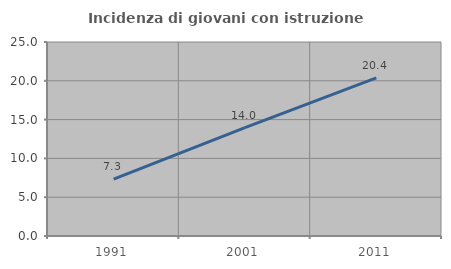
| Category | Incidenza di giovani con istruzione universitaria |
|---|---|
| 1991.0 | 7.327 |
| 2001.0 | 13.974 |
| 2011.0 | 20.37 |